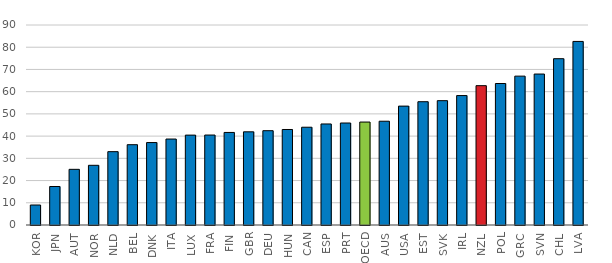
| Category | Asset-based poverty |
|---|---|
| KOR | 9 |
| JPN | 17.325 |
| AUT | 25.05 |
| NOR | 26.86 |
| NLD | 33 |
| BEL | 36.14 |
| DNK | 37.102 |
| ITA | 38.68 |
| LUX | 40.45 |
| FRA | 40.48 |
| FIN | 41.65 |
| GBR | 41.93 |
| DEU | 42.44 |
| HUN | 42.98 |
| CAN | 44 |
| ESP | 45.47 |
| PRT | 45.9 |
| OECD | 46.324 |
| AUS | 46.7 |
| USA | 53.5 |
| EST | 55.48 |
| SVK | 55.95 |
| IRL | 58.24 |
| NZL | 62.7 |
| POL | 63.67 |
| GRC | 66.99 |
| SVN | 67.93 |
| CHL | 74.838 |
| LVA | 82.61 |